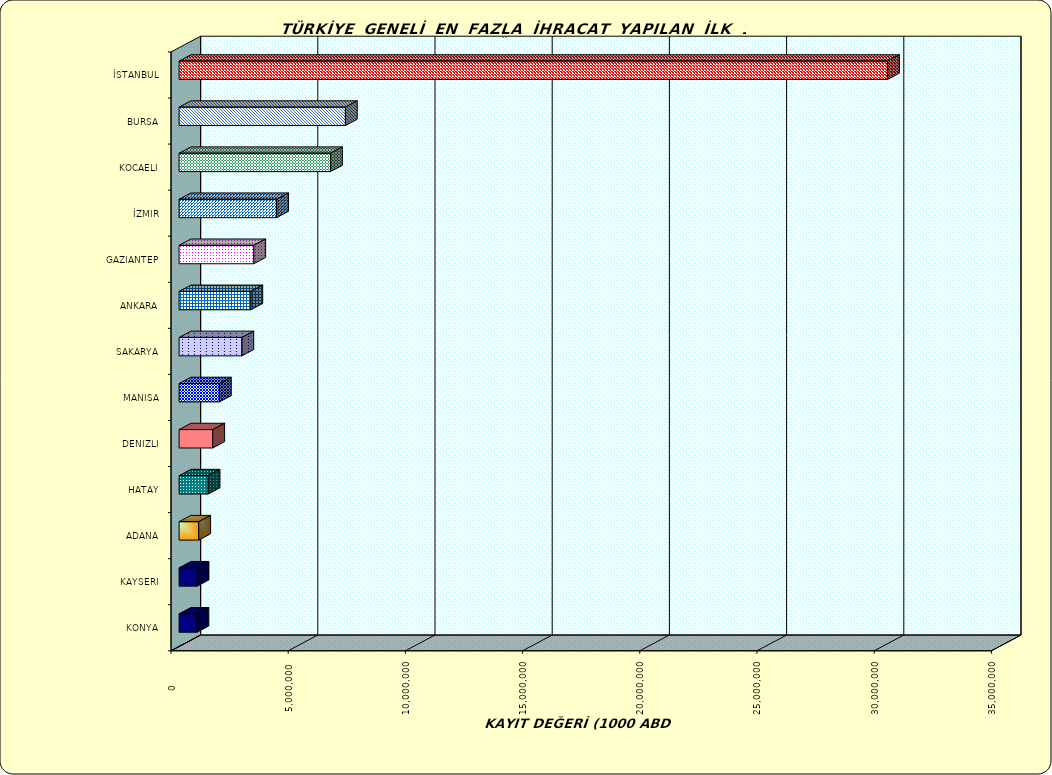
| Category | Series 0 |
|---|---|
| İSTANBUL | 30225210.837 |
| BURSA | 7095674.402 |
| KOCAELI | 6462977.801 |
| İZMIR | 4162189.809 |
| GAZIANTEP | 3187100.234 |
| ANKARA | 3062576.181 |
| SAKARYA | 2678932.608 |
| MANISA | 1721084.089 |
| DENIZLI | 1436846.843 |
| HATAY | 1239665.881 |
| ADANA | 839128.601 |
| KAYSERI | 767894.011 |
| KONYA | 763663.336 |